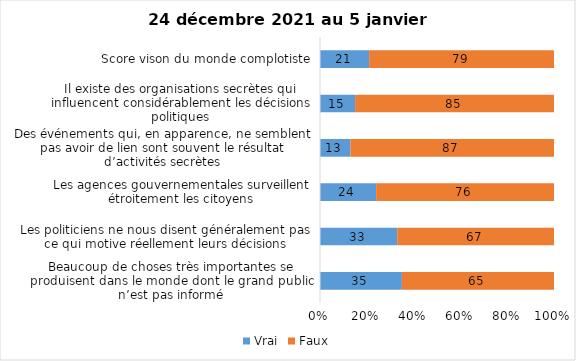
| Category | Vrai | Faux |
|---|---|---|
| Beaucoup de choses très importantes se produisent dans le monde dont le grand public n’est pas informé | 35 | 65 |
| Les politiciens ne nous disent généralement pas ce qui motive réellement leurs décisions | 33 | 67 |
| Les agences gouvernementales surveillent étroitement les citoyens | 24 | 76 |
| Des événements qui, en apparence, ne semblent pas avoir de lien sont souvent le résultat d’activités secrètes | 13 | 87 |
| Il existe des organisations secrètes qui influencent considérablement les décisions politiques | 15 | 85 |
| Score vison du monde complotiste | 21 | 79 |